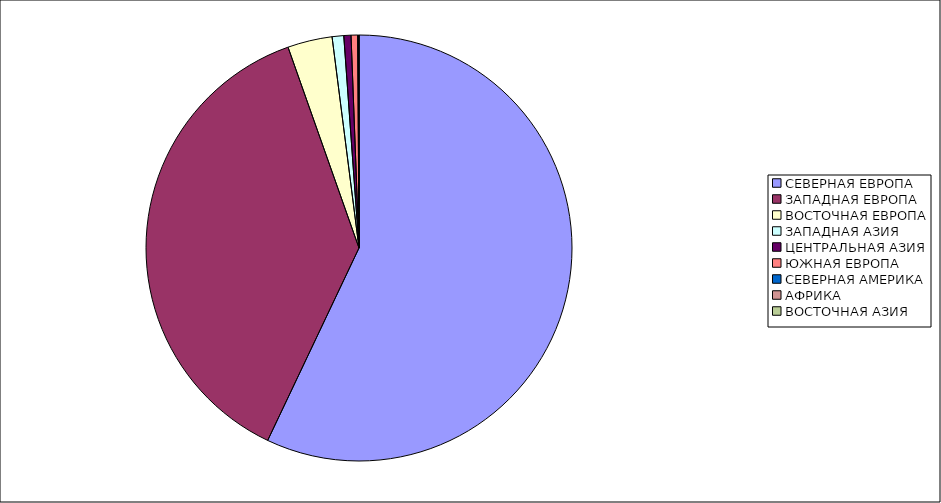
| Category | Оборот |
|---|---|
| СЕВЕРНАЯ ЕВРОПА | 57.052 |
| ЗАПАДНАЯ ЕВРОПА | 37.541 |
| ВОСТОЧНАЯ ЕВРОПА | 3.386 |
| ЗАПАДНАЯ АЗИЯ | 0.88 |
| ЦЕНТРАЛЬНАЯ АЗИЯ | 0.544 |
| ЮЖНАЯ ЕВРОПА | 0.5 |
| СЕВЕРНАЯ АМЕРИКА | 0.046 |
| АФРИКА | 0.043 |
| ВОСТОЧНАЯ АЗИЯ | 0.007 |